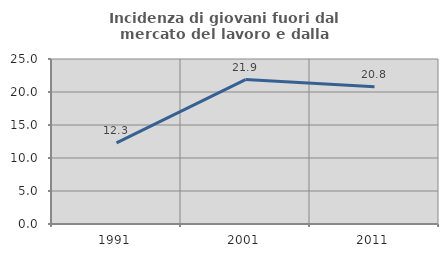
| Category | Incidenza di giovani fuori dal mercato del lavoro e dalla formazione  |
|---|---|
| 1991.0 | 12.278 |
| 2001.0 | 21.885 |
| 2011.0 | 20.79 |